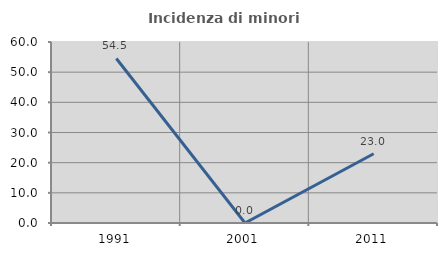
| Category | Incidenza di minori stranieri |
|---|---|
| 1991.0 | 54.545 |
| 2001.0 | 0 |
| 2011.0 | 22.951 |